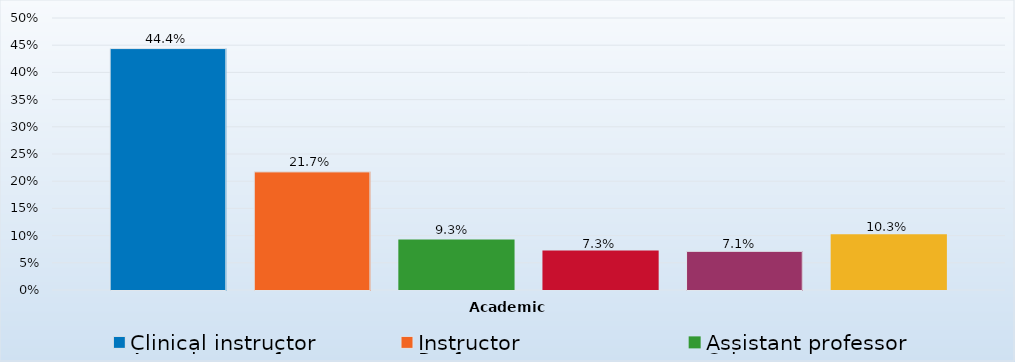
| Category | Clinical instructor | Instructor | Assistant professor | Associate professor | Professor | Other |
|---|---|---|---|---|---|---|
| 0 | 0.444 | 0.217 | 0.093 | 0.073 | 0.071 | 0.103 |